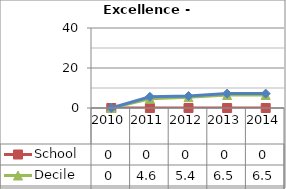
| Category | School  | Decile | National |
|---|---|---|---|
| 2010.0 | 0 | 0 | 0 |
| 2011.0 | 0 | 4.6 | 5.6 |
| 2012.0 | 0 | 5.4 | 6 |
| 2013.0 | 0 | 6.5 | 7.2 |
| 2014.0 | 0 | 6.5 | 7.2 |